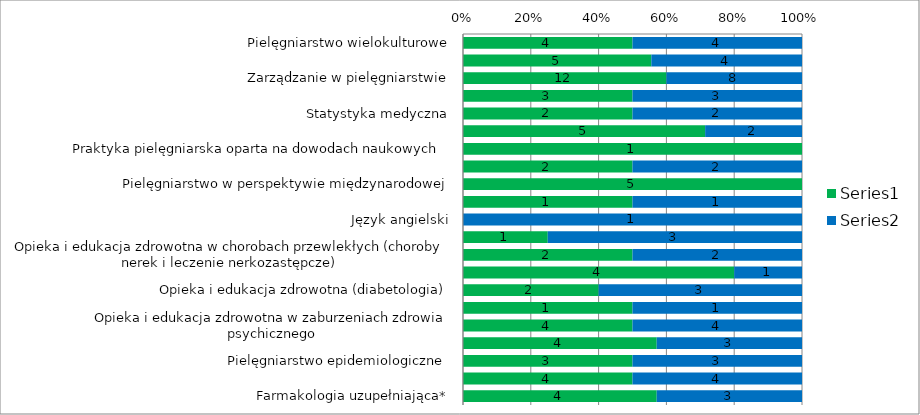
| Category | Series 0 | Series 1 |
|---|---|---|
| Pielęgniarstwo wielokulturowe | 4 | 4 |
| Prawo w praktyce pielęgniarskiej | 5 | 4 |
| Zarządzanie w pielęgniarstwie | 12 | 8 |
| Badania naukowe w pielęgniarstwie | 3 | 3 |
| Statystyka medyczna | 2 | 2 |
| Psychologia zdrowia  | 5 | 2 |
| Praktyka pielęgniarska oparta na dowodach naukowych  | 1 | 0 |
| Informacja naukowa | 2 | 2 |
| Pielęgniarstwo w perspektywie międzynarodowej | 5 | 0 |
| Seminarium dyplomowe  | 1 | 1 |
| Język angielski | 0 | 1 |
| Opieka i edukacja zdrowotna w chorobach przewlekłych (choroby kardiologiczne) | 1 | 3 |
| Opieka i edukacja zdrowotna w chorobach przewlekłych (choroby nerek i leczenie nerkozastępcze)  | 2 | 2 |
| Opieka i edukacja zdrowotna w chorobach przewlekłych (choroby układu oddechowego) | 4 | 1 |
| Opieka i edukacja zdrowotna (diabetologia) | 2 | 3 |
| Opieka i edukacja zdrowotna w zaburzeniach układu nerwowego | 1 | 1 |
| Opieka i edukacja zdrowotna w zaburzeniach zdrowia psychicznego | 4 | 4 |
| Opieka i edukacja zdrowotna w chorobach przewlekłych  nowotworowych  | 4 | 3 |
| Pielęgniarstwo epidemiologiczne  | 3 | 3 |
| Farmakologia i ordynowanie produktów leczniczych | 4 | 4 |
| Farmakologia uzupełniająca* | 4 | 3 |